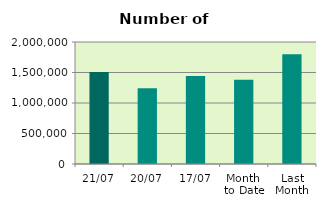
| Category | Series 0 |
|---|---|
| 21/07 | 1506874 |
| 20/07 | 1242382 |
| 17/07 | 1443330 |
| Month 
to Date | 1379687.467 |
| Last
Month | 1799892.818 |